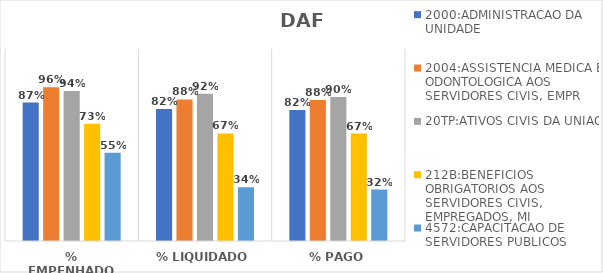
| Category | 2000:ADMINISTRACAO DA UNIDADE | 2004:ASSISTENCIA MEDICA E ODONTOLOGICA AOS SERVIDORES CIVIS, EMPR | 20TP:ATIVOS CIVIS DA UNIAO | 212B:BENEFICIOS OBRIGATORIOS AOS SERVIDORES CIVIS, EMPREGADOS, MI | 4572:CAPACITACAO DE SERVIDORES PUBLICOS FEDERAIS EM PROCESSO DE Q |
|---|---|---|---|---|---|
| % EMPENHADO | 0.865 | 0.961 | 0.938 | 0.733 | 0.552 |
| % LIQUIDADO | 0.825 | 0.885 | 0.92 | 0.672 | 0.336 |
| % PAGO | 0.819 | 0.881 | 0.9 | 0.671 | 0.322 |